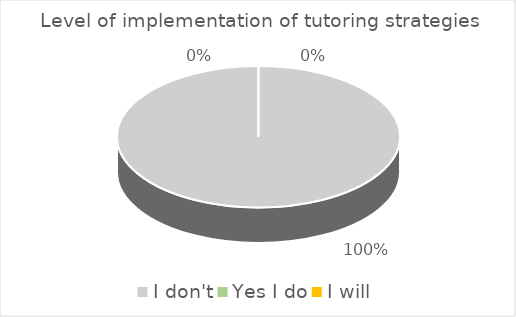
| Category | Series 0 |
|---|---|
| I don't | 48 |
| Yes I do | 0 |
| I will | 0 |